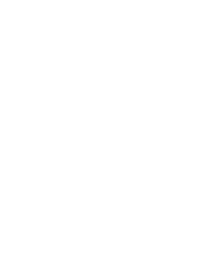
| Category | Оң | Теріс |
|---|---|---|
| 0 | 0 | 0 |
| 1 | 192 | 0 |
| 2 | 192 | -192 |